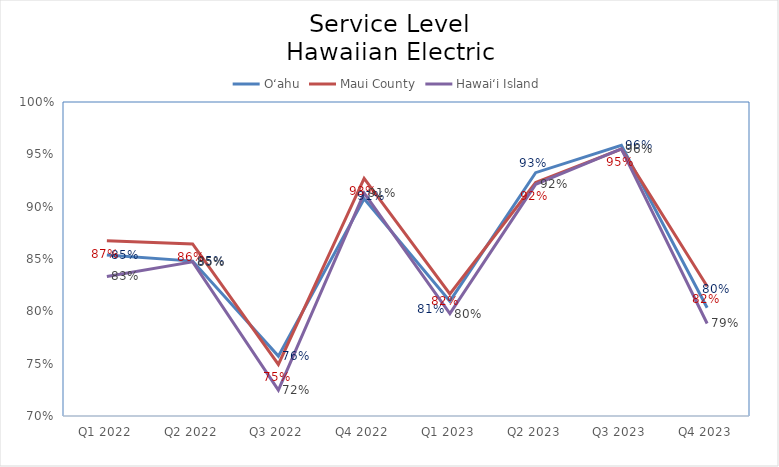
| Category | O‘ahu | Maui County | Hawai‘i Island |
|---|---|---|---|
| Q1 2022 | 0.854 | 0.867 | 0.833 |
| Q2 2022 | 0.848 | 0.864 | 0.847 |
| Q3 2022 | 0.757 | 0.749 | 0.725 |
| Q4 2022 | 0.908 | 0.927 | 0.913 |
| Q1 2023 | 0.81 | 0.817 | 0.798 |
| Q2 2023 | 0.933 | 0.923 | 0.921 |
| Q3 2023 | 0.959 | 0.955 | 0.955 |
| Q4 2023 | 0.803 | 0.824 | 0.788 |